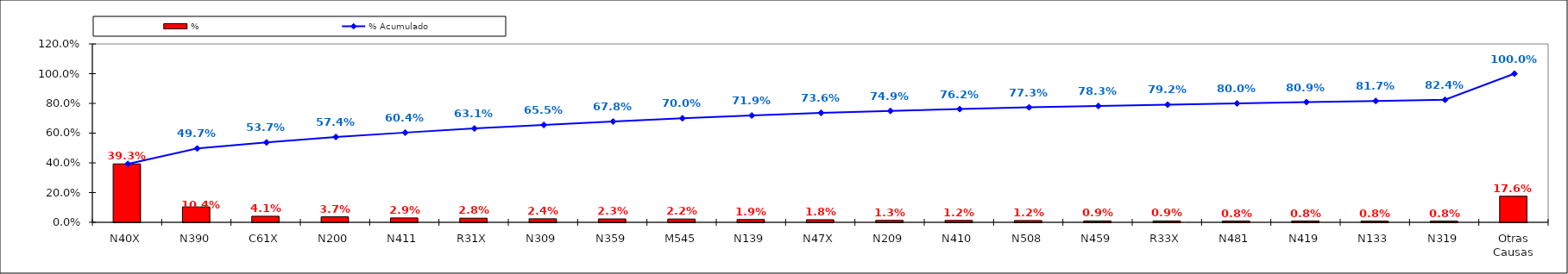
| Category | % |
|---|---|
| N40X | 0.393 |
| N390 | 0.104 |
| C61X | 0.041 |
| N200 | 0.037 |
| N411 | 0.029 |
| R31X | 0.028 |
| N309 | 0.024 |
| N359 | 0.023 |
| M545 | 0.022 |
| N139 | 0.019 |
| N47X | 0.018 |
| N209 | 0.013 |
| N410 | 0.012 |
| N508 | 0.012 |
| N459 | 0.009 |
| R33X | 0.009 |
| N481 | 0.008 |
| N419 | 0.008 |
| N133 | 0.008 |
| N319 | 0.008 |
| Otras Causas | 0.176 |